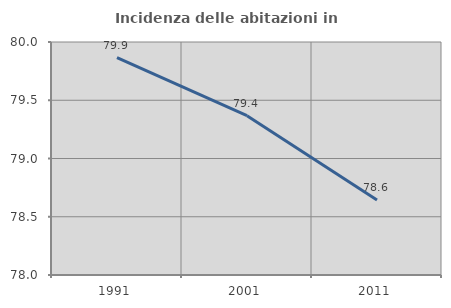
| Category | Incidenza delle abitazioni in proprietà  |
|---|---|
| 1991.0 | 79.866 |
| 2001.0 | 79.368 |
| 2011.0 | 78.644 |